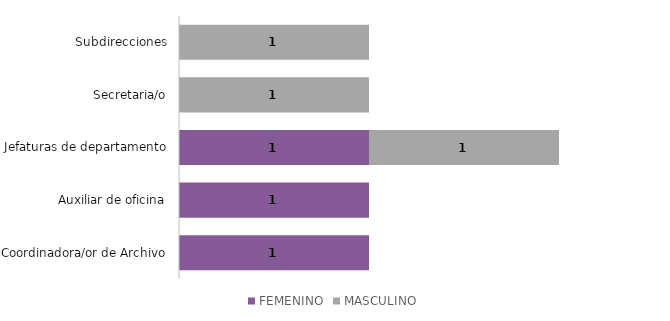
| Category | FEMENINO | MASCULINO |
|---|---|---|
| Coordinadora/or de Archivo | 1 | 0 |
| Auxiliar de oficina | 1 | 0 |
| Jefaturas de departamento | 1 | 1 |
| Secretaria/o | 0 | 1 |
| Subdirecciones | 0 | 1 |